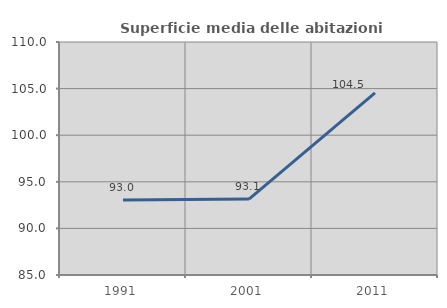
| Category | Superficie media delle abitazioni occupate |
|---|---|
| 1991.0 | 93.048 |
| 2001.0 | 93.15 |
| 2011.0 | 104.532 |